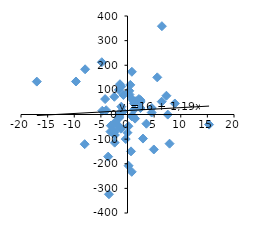
| Category | Mexico |
|---|---|
| 0.660000000000005 | -149.683 |
| 15.32 | -41.016 |
| -17.02999999999999 | 133.613 |
| -4.74 | 15.256 |
| 2.9099999999999904 | -97.721 |
| -8.040000000000003 | -120.503 |
| -1.419999999999999 | 122.847 |
| -3.9999999999999925 | 17.335 |
| -9.68 | 133.954 |
| 5.5899999999999945 | 150.83 |
| -2.42 | -69.687 |
| 4.9399999999999995 | -142.037 |
| 0.34000000000000696 | 96.115 |
| -1.6199999999999992 | 100.022 |
| -2.410000000000001 | -114.32 |
| -1.5900000000000025 | -48.181 |
| 8.889999999999997 | 44.733 |
| 0.18000000000000238 | -47.573 |
| -4.830000000000001 | 212.273 |
| 1.419999999999999 | -16.77 |
| -2.4699999999999998 | 71.912 |
| -7.9600000000000035 | 183.615 |
| 3.6500000000000004 | 632.981 |
| 0.20000000000000018 | -208.046 |
| 1.5899999999999999 | 53.916 |
| -2.37 | -83.171 |
| 6.429999999999997 | 52.232 |
| -0.8400000000000019 | 12.457 |
| 0.8199999999999985 | 173.5 |
| 1.200000000000001 | 19.188 |
| 0.8000000000000007 | -232.742 |
| 2.430000000000004 | 26.17 |
| 1.200000000000001 | 54.12 |
| -1.5600000000000003 | -9.045 |
| 0.8099999999999996 | -7.64 |
| -1.16 | 31.761 |
| 6.459999999999999 | 358.582 |
| 1.200000000000001 | 45.33 |
| -3.63 | -171.015 |
| -0.7699999999999985 | 79.336 |
| 4.539999999999999 | 7.87 |
| 0.37000000000000366 | 81.135 |
| 7.31 | 76.157 |
| -3.1300000000000052 | -45.286 |
| -3.200000000000003 | -69.55 |
| -1.1700000000000044 | 113.76 |
| 2.4399999999999977 | 58.418 |
| 7.5600000000000005 | -0.372 |
| 7.899999999999996 | -118.51 |
| 0.5300000000000082 | 120.288 |
| -2.650000000000008 | -64.661 |
| 0.9250000000000091 | 60.965 |
| -2.3249999999999993 | -31.237 |
| 0.9399999999999964 | -4.425 |
| -4.200000000000004 | 62.589 |
| 2.4499999999999966 | 51.183 |
| 3.5500000000000087 | -37.353 |
| -0.01500000000000945 | -73.611 |
| -3.4800000000000164 | -323.871 |
| -1.2599999999999945 | -57.676 |
| -1.475000000000004 | 5.174 |
| 2.1399999999999864 | 62.76 |
| -0.33400000000001207 | -99.681 |
| -1.556000000000024 | -13.446 |
| 4.5560000000000045 | 26.396 |